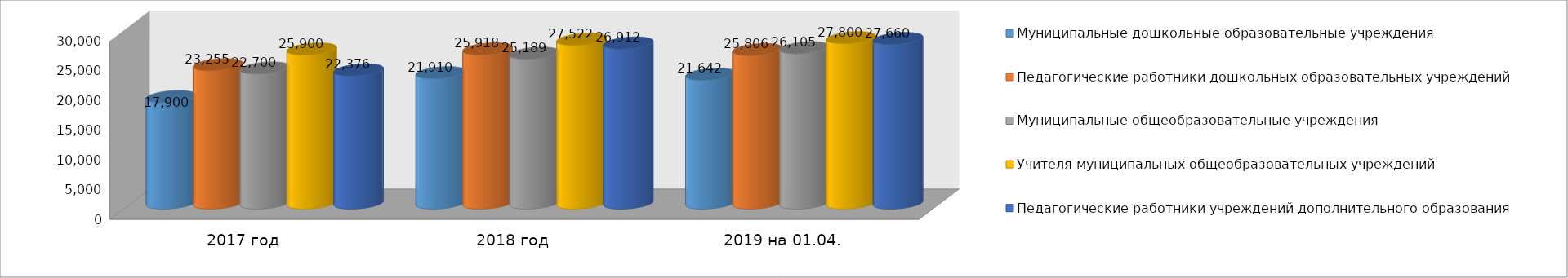
| Category | Муниципальные дошкольные образовательные учреждения | Педагогические работники дошкольных образовательных учреждений | Муниципальные общеобразовательные учреждения | Учителя муниципальных общеобразовательных учреждений | Педагогические работники учреждений дополнительного образования |
|---|---|---|---|---|---|
| 2017 год | 17900 | 23255 | 22700 | 25900 | 22376 |
| 2018 год | 21910 | 25918 | 25189 | 27522 | 26912 |
| 2019 на 01.04. | 21651 | 25806 | 26105 | 27800 | 27660 |